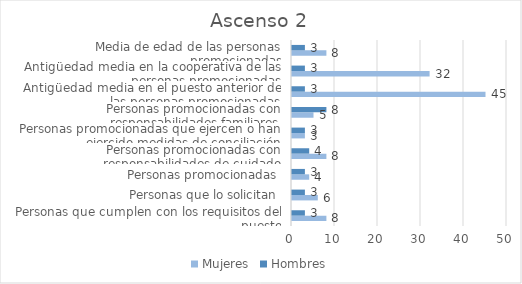
| Category | Mujeres | Hombres |
|---|---|---|
| Personas que cumplen con los requisitos del puesto | 8 | 3 |
| Personas que lo solicitan | 6 | 3 |
| Personas promocionadas | 4 | 3 |
| Personas promocionadas con responsabilidades de cuidado | 8 | 4 |
| Personas promocionadas que ejercen o han ejercido medidas de conciliación | 3 | 3 |
| Personas promocionadas con responsabilidades familiares | 5 | 8 |
| Antigüedad media en el puesto anterior de las personas promocionadas | 45 | 3 |
| Antigüedad media en la cooperativa de las personas promocionadas | 32 | 3 |
| Media de edad de las personas promocionadas | 8 | 3 |